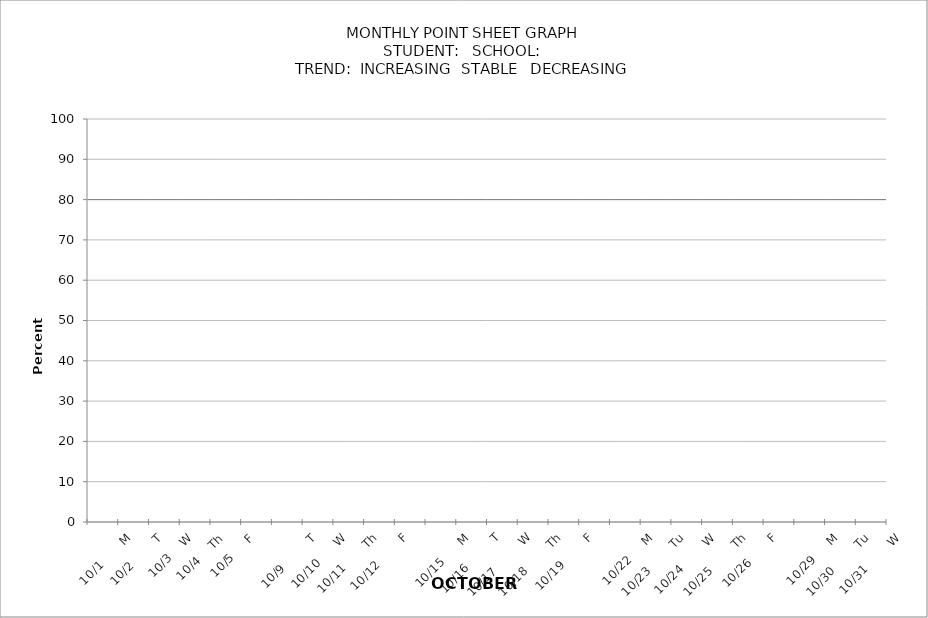
| Category | PERCENTAGE | target |
|---|---|---|
|  |  | 80 |
| 10/1       M |  | 80 |
| 10/2        T |  | 80 |
| 10/3    W |  | 80 |
| 10/4    Th |  | 80 |
| 10/5     F |  | 80 |
|  |  | 80 |
| 10/9         T |  | 80 |
| 10/10      W |  | 80 |
| 10/11       Th |  | 80 |
| 10/12        F |  | 80 |
|  |  | 80 |
| 10/15      M |  | 80 |
| 10/16         T |  | 80 |
| 10/17         W |  | 80 |
| 10/18        Th |  | 80 |
| 10/19        F |  | 80 |
|  |  | 80 |
| 10/22     M |  | 80 |
| 10/23        Tu |  | 80 |
| 10/24        W |  | 80 |
| 10/25        Th |  | 80 |
| 10/26       F |  | 80 |
|  |  | 80 |
| 10/29     M |  | 80 |
| 10/30        Tu |  | 80 |
| 10/31        W |  | 80 |